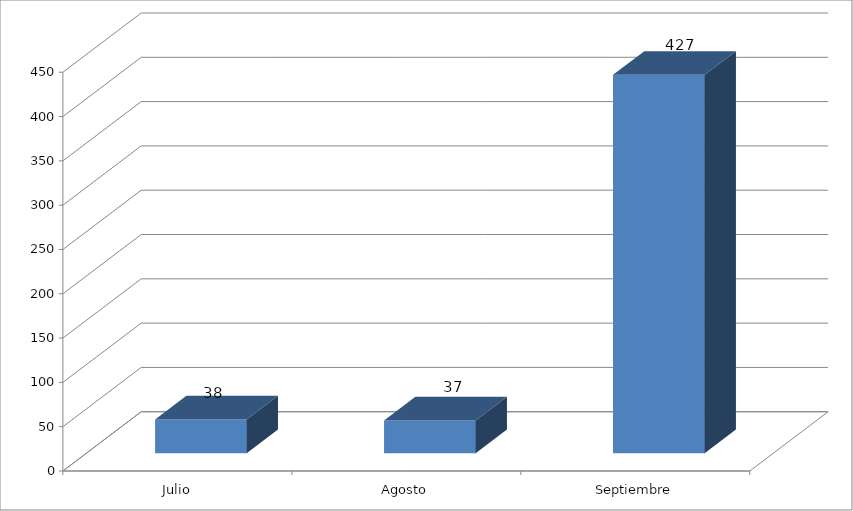
| Category | Series 0 |
|---|---|
| Julio | 38 |
| Agosto | 37 |
| Septiembre | 427 |